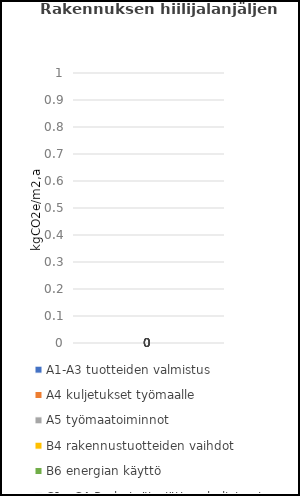
| Category | A1-A3 tuotteiden valmistus | A4 kuljetukset työmaalle | A5 työmaatoiminnot | B4 rakennustuotteiden vaihdot | B6 energian käyttö | C1 - C4 Purkutyöt, -jätteenkuljetus ja -jätehuolto |
|---|---|---|---|---|---|---|
| 0 | 0 | 0 | 0 | 0 | 0 | 0 |